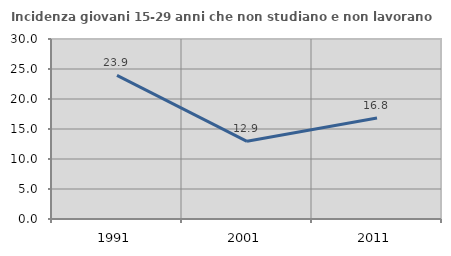
| Category | Incidenza giovani 15-29 anni che non studiano e non lavorano  |
|---|---|
| 1991.0 | 23.932 |
| 2001.0 | 12.948 |
| 2011.0 | 16.822 |